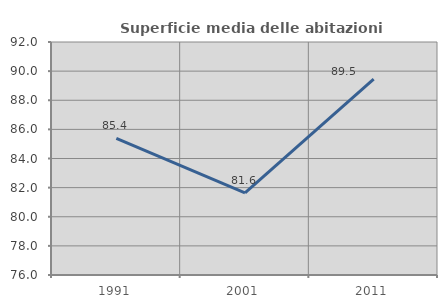
| Category | Superficie media delle abitazioni occupate |
|---|---|
| 1991.0 | 85.377 |
| 2001.0 | 81.646 |
| 2011.0 | 89.452 |